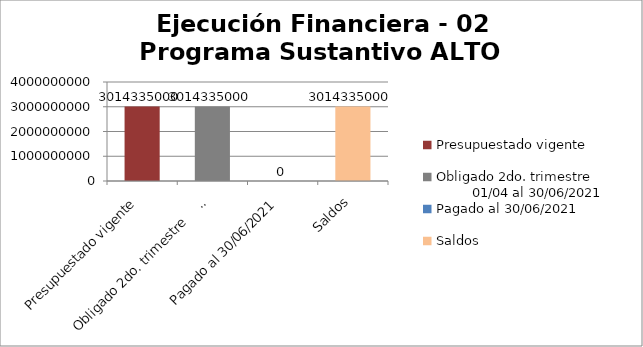
| Category | 4.8 Ejecución Financiera (Generar gráfica) |
|---|---|
| Presupuestado vigente | 3014335000 |
| Obligado 2do. trimestre                      01/04 al 30/06/2021 | 3014335000 |
| Pagado al 30/06/2021 | 0 |
| Saldos | 3014335000 |